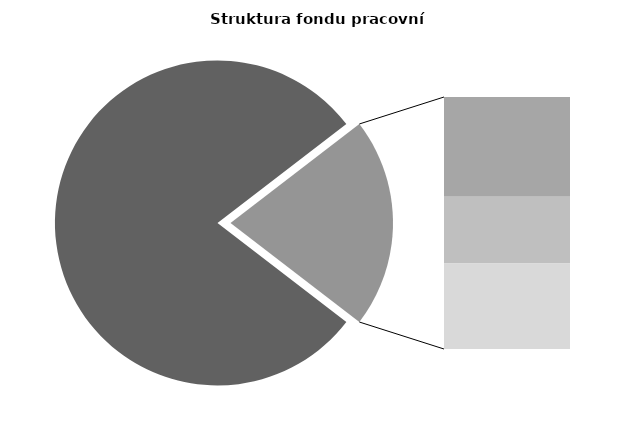
| Category | Series 0 |
|---|---|
| Průměrná měsíční odpracovaná doba bez přesčasu | 135.194 |
| Dovolená | 14.106 |
| Nemoc | 9.443 |
| Jiné | 12.079 |